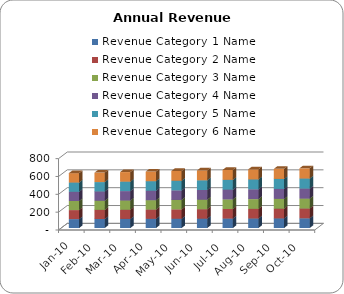
| Category | Revenue Category 1 Name | Revenue Category 2 Name | Revenue Category 3 Name | Revenue Category 4 Name | Revenue Category 5 Name | Revenue Category 6 Name |
|---|---|---|---|---|---|---|
| Jan-10  | 100 | 101 | 102 | 103 | 104 | 105 |
| Feb-10  | 101 | 102 | 103 | 104 | 105 | 106 |
| Mar-10  | 102 | 103 | 104 | 105 | 106 | 107 |
| Apr-10  | 103 | 104 | 105 | 106 | 107 | 108 |
| May-10  | 104 | 105 | 106 | 107 | 108 | 109 |
| Jun-10  | 105 | 106 | 107 | 108 | 109 | 110 |
| Jul-10  | 106 | 107 | 108 | 109 | 110 | 111 |
| Aug-10  | 107 | 108 | 109 | 110 | 111 | 112 |
| Sep-10  | 108 | 109 | 110 | 111 | 112 | 113 |
| Oct-10  | 109 | 110 | 111 | 112 | 113 | 114 |